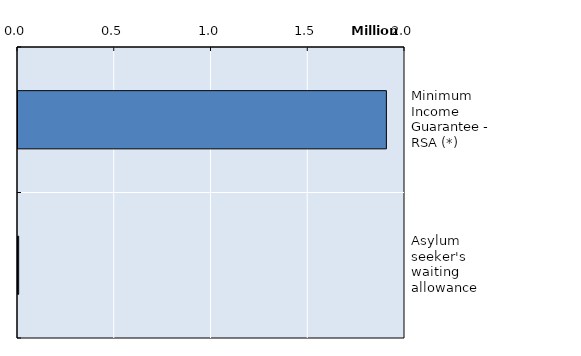
| Category | Series 0 |
|---|---|
| Minimum Income Guarantee - RSA (*) | 1903800 |
| Asylum seeker's waiting allowance | 3428.167 |